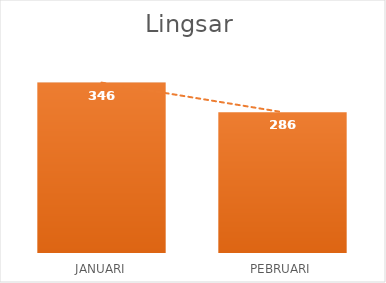
| Category | Series 0 |
|---|---|
| JANUARI | 346 |
| PEBRUARI | 286 |